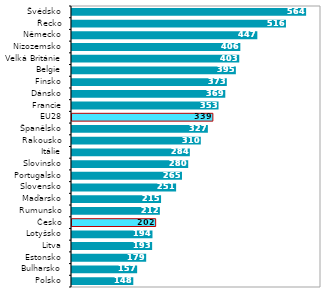
| Category |  2016 |
|---|---|
| Polsko | 147.712 |
| Bulharsko | 156.966 |
| Estonsko | 178.731 |
| Litva | 193.107 |
| Lotyšsko | 193.91 |
| Česko | 201.576 |
| Rumunsko | 211.692 |
| Maďarsko | 214.598 |
| Slovensko | 250.873 |
| Portugalsko | 265.034 |
| Slovinsko | 280.013 |
| Itálie | 283.952 |
| Rakousko | 310.363 |
| Španělsko | 327.368 |
| EU28 | 339.43 |
| Francie | 353.062 |
| Dánsko | 369.39 |
| Finsko | 373.043 |
| Belgie | 394.833 |
| Velká Británie | 403.007 |
| Nizozemsko | 405.616 |
| Německo | 446.592 |
| Řecko | 515.554 |
| Švédsko | 564.124 |